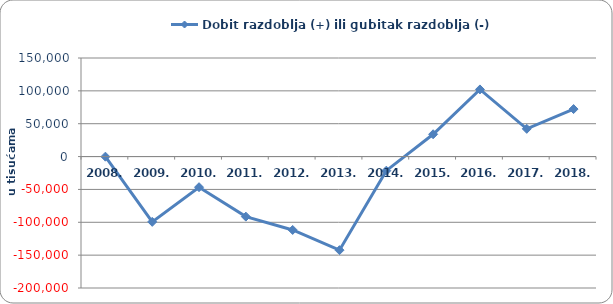
| Category | Dobit razdoblja (+) ili gubitak razdoblja (-)  |
|---|---|
| 2008. | -145.357 |
| 2009. | -99330.516 |
| 2010. | -46616.385 |
| 2011. | -91386.482 |
| 2012. | -111650.371 |
| 2013. | -142419.237 |
| 2014. | -21480.141 |
| 2015. | 33966.201 |
| 2016. | 102168.845 |
| 2017. | 42210.899 |
| 2018. | 72279.005 |